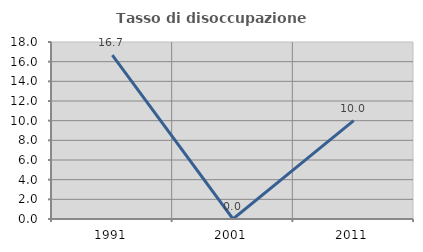
| Category | Tasso di disoccupazione giovanile  |
|---|---|
| 1991.0 | 16.667 |
| 2001.0 | 0 |
| 2011.0 | 10 |